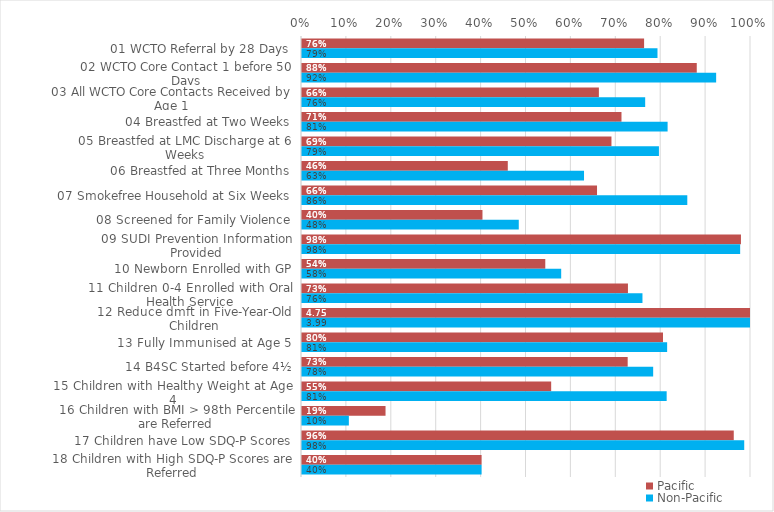
| Category | Pacific | Non-Pacific |
|---|---|---|
| 01 WCTO Referral by 28 Days | 0.762 | 0.792 |
| 02 WCTO Core Contact 1 before 50 Days | 0.879 | 0.922 |
| 03 All WCTO Core Contacts Received by Age 1 | 0.661 | 0.764 |
| 04 Breastfed at Two Weeks | 0.712 | 0.814 |
| 05 Breastfed at LMC Discharge at 6 Weeks | 0.689 | 0.795 |
| 06 Breastfed at Three Months | 0.458 | 0.628 |
| 07 Smokefree Household at Six Weeks | 0.657 | 0.858 |
| 08 Screened for Family Violence | 0.402 | 0.483 |
| 09 SUDI Prevention Information Provided | 0.978 | 0.976 |
| 10 Newborn Enrolled with GP | 0.542 | 0.577 |
| 11 Children 0-4 Enrolled with Oral Health Service | 0.726 | 0.758 |
| 12 Reduce dmft in Five-Year-Old Children | 4.752 | 3.992 |
| 13 Fully Immunised at Age 5 | 0.804 | 0.813 |
| 14 B4SC Started before 4½ | 0.725 | 0.782 |
| 15 Children with Healthy Weight at Age 4 | 0.555 | 0.812 |
| 16 Children with BMI > 98th Percentile are Referred | 0.186 | 0.104 |
| 17 Children have Low SDQ-P Scores | 0.962 | 0.985 |
| 18 Children with High SDQ-P Scores are Referred | 0.4 | 0.4 |